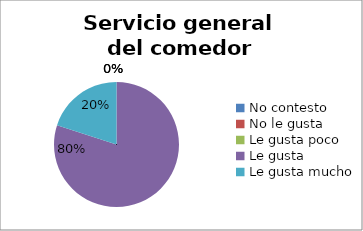
| Category | Series 0 |
|---|---|
| No contesto | 0 |
| No le gusta | 0 |
| Le gusta poco | 0 |
| Le gusta | 4 |
| Le gusta mucho | 1 |